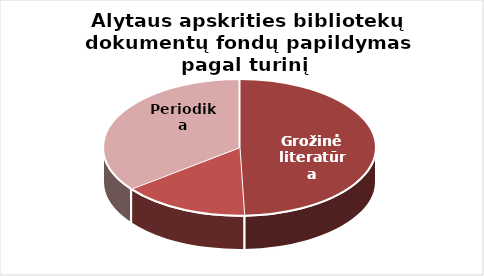
| Category | Series 0 |
|---|---|
| Grožinė literatūra | 16976 |
| Šakinė literatūra | 5200 |
| Periodika | 12155 |